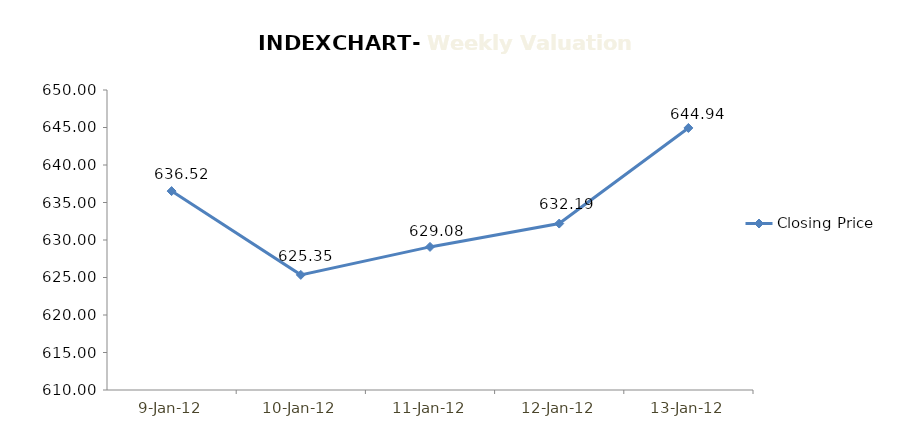
| Category | Closing Price |
|---|---|
| 2012-01-09 | 636.52 |
| 2012-01-10 | 625.35 |
| 2012-01-11 | 629.08 |
| 2012-01-12 | 632.19 |
| 2012-01-13 | 644.94 |